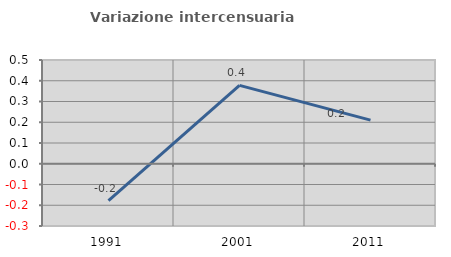
| Category | Variazione intercensuaria annua |
|---|---|
| 1991.0 | -0.178 |
| 2001.0 | 0.378 |
| 2011.0 | 0.21 |